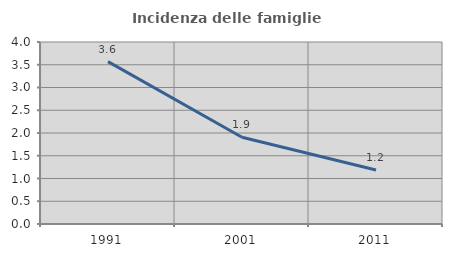
| Category | Incidenza delle famiglie numerose |
|---|---|
| 1991.0 | 3.569 |
| 2001.0 | 1.907 |
| 2011.0 | 1.185 |